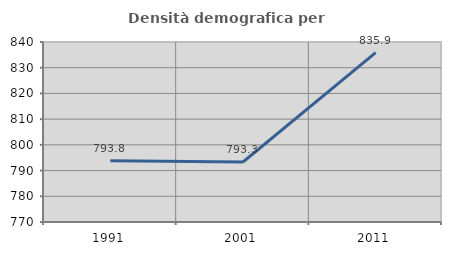
| Category | Densità demografica |
|---|---|
| 1991.0 | 793.809 |
| 2001.0 | 793.323 |
| 2011.0 | 835.86 |